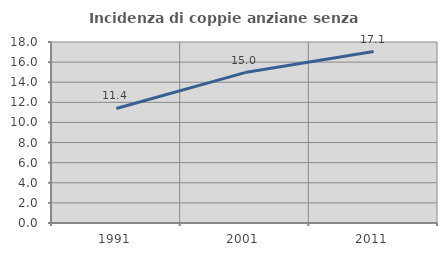
| Category | Incidenza di coppie anziane senza figli  |
|---|---|
| 1991.0 | 11.391 |
| 2001.0 | 14.957 |
| 2011.0 | 17.051 |